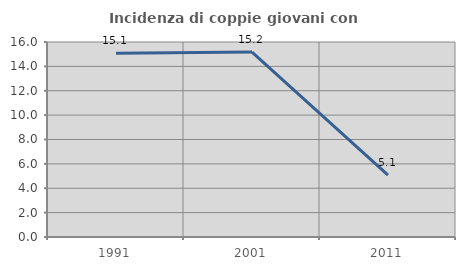
| Category | Incidenza di coppie giovani con figli |
|---|---|
| 1991.0 | 15.071 |
| 2001.0 | 15.175 |
| 2011.0 | 5.069 |